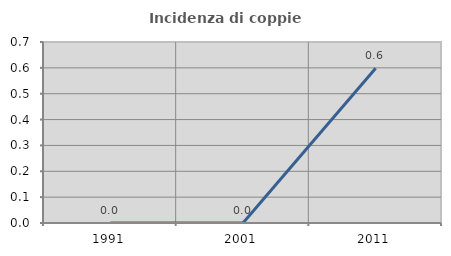
| Category | Incidenza di coppie miste |
|---|---|
| 1991.0 | 0 |
| 2001.0 | 0 |
| 2011.0 | 0.599 |